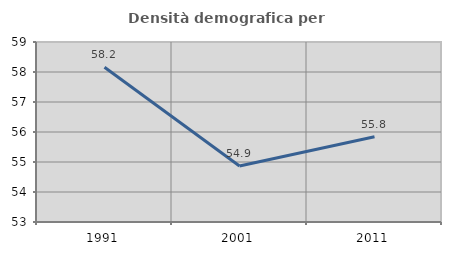
| Category | Densità demografica |
|---|---|
| 1991.0 | 58.156 |
| 2001.0 | 54.869 |
| 2011.0 | 55.843 |